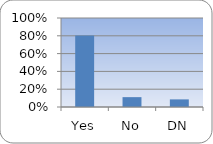
| Category | Series 0 |
|---|---|
| Yes | 0.804 |
| No | 0.111 |
| DN | 0.086 |